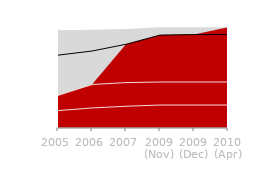
| Category | Facebook | Your Network | Friends | You |
|---|---|---|---|---|
| 2005 | 5000000 | 1000 | 40 | 1 |
| 2006 | 12000000 | 10000 | 70 | 1 |
| 2007 | 50000000 | 15000 | 100 | 1 |
| 2009
(Nov) | 350000000 | 17000 | 130 | 1 |
| 2009
(Dec) | 390000000 | 17000 | 130 | 1 |
| 2010
(Apr) | 400000000 | 17000 | 130 | 1 |